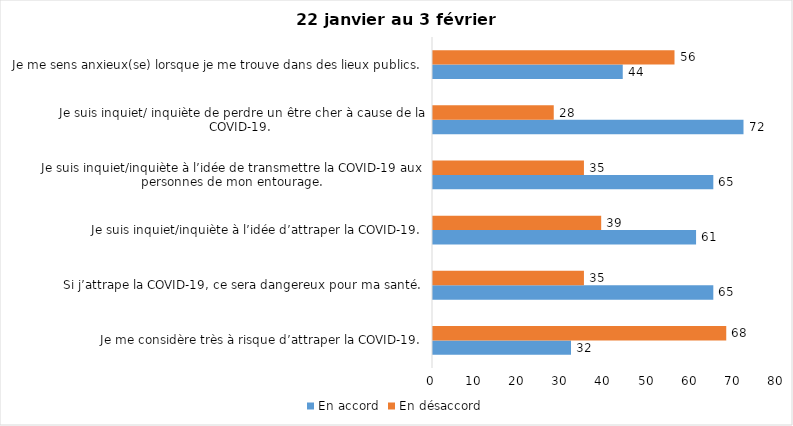
| Category | En accord | En désaccord |
|---|---|---|
| Je me considère très à risque d’attraper la COVID-19. | 32 | 68 |
| Si j’attrape la COVID-19, ce sera dangereux pour ma santé. | 65 | 35 |
| Je suis inquiet/inquiète à l’idée d’attraper la COVID-19. | 61 | 39 |
| Je suis inquiet/inquiète à l’idée de transmettre la COVID-19 aux personnes de mon entourage. | 65 | 35 |
| Je suis inquiet/ inquiète de perdre un être cher à cause de la COVID-19. | 72 | 28 |
| Je me sens anxieux(se) lorsque je me trouve dans des lieux publics. | 44 | 56 |